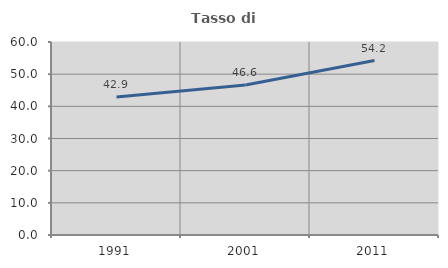
| Category | Tasso di occupazione   |
|---|---|
| 1991.0 | 42.879 |
| 2001.0 | 46.647 |
| 2011.0 | 54.242 |